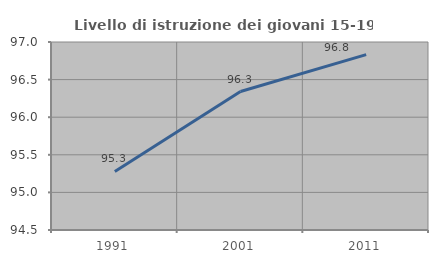
| Category | Livello di istruzione dei giovani 15-19 anni |
|---|---|
| 1991.0 | 95.279 |
| 2001.0 | 96.341 |
| 2011.0 | 96.833 |